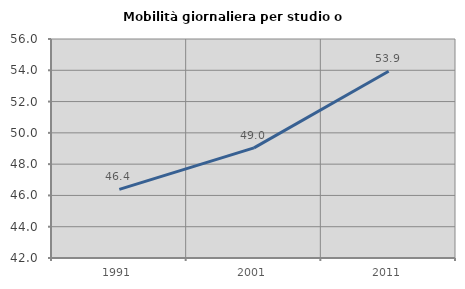
| Category | Mobilità giornaliera per studio o lavoro |
|---|---|
| 1991.0 | 46.384 |
| 2001.0 | 49.038 |
| 2011.0 | 53.935 |